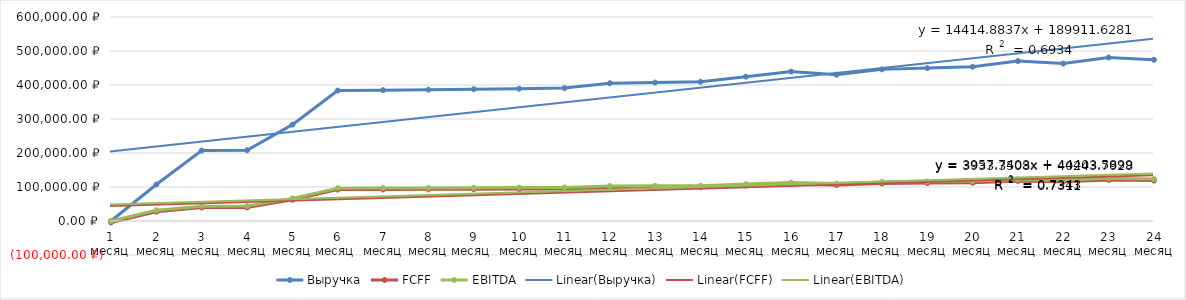
| Category | Выручка | FCFF | EBITDA |
|---|---|---|---|
| 1 месяц | 0 | -4269 | 0 |
| 2 месяц | 107200 | 27350 | 31619 |
| 3 месяц | 207200 | 39349 | 43619 |
| 4 месяц | 208080 | 39613 | 43883 |
| 5 месяц | 283448 | 62223.4 | 66493.4 |
| 6 месяц  | 383712.8 | 92302.84 | 96572.84 |
| 7 месяц | 384884.08 | 92654.224 | 96924.224 |
| 8 месяц | 386172.488 | 93040.746 | 97310.746 |
| 9 месяц  | 387589.737 | 93465.921 | 97735.921 |
| 10 месяц | 389148.71 | 93933.613 | 98203.613 |
| 11 месяц | 390863.582 | 94448.074 | 98718.074 |
| 12 месяц | 405149.94 | 98733.982 | 103003.982 |
| 13 месяц | 407224.934 | 98695.48 | 103355.48 |
| 14 месяц | 409507.427 | 99380.228 | 104040.228 |
| 15 месяц | 424418.17 | 103853.451 | 108513.451 |
| 16 месяц | 439579.987 | 108401.996 | 113061.996 |
| 17 месяц | 430217.985 | 105593.396 | 110253.396 |
| 18 месяц | 445959.784 | 110315.935 | 114975.935 |
| 19 месяц | 449635.762 | 111419.729 | 116078.729 |
| 20 месяц | 453679.339 | 112632.802 | 117291.802 |
| 21 месяц | 470527.272 | 117687.182 | 122346.182 |
| 22 месяц | 463020 | 115435 | 120094 |
| 23 месяц | 480802 | 120769.6 | 125428.6 |
| 24 месяц | 474322.2 | 118825.66 | 123484.66 |